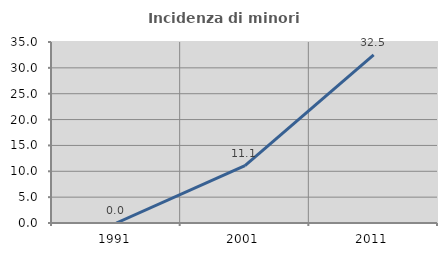
| Category | Incidenza di minori stranieri |
|---|---|
| 1991.0 | 0 |
| 2001.0 | 11.111 |
| 2011.0 | 32.53 |